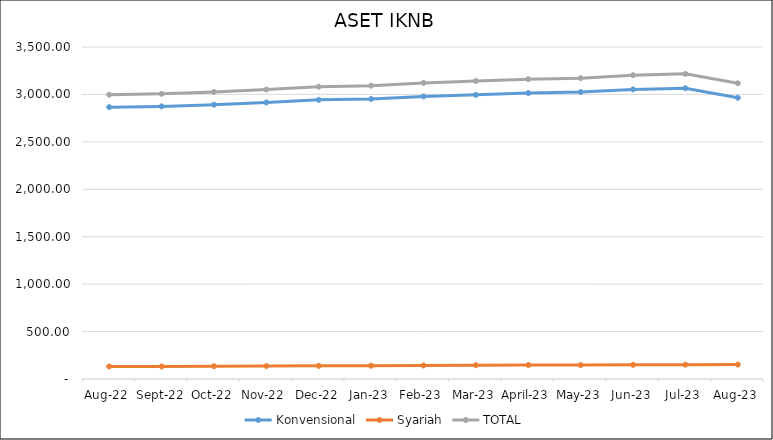
| Category |  Konvensional  |  Syariah  | TOTAL |
|---|---|---|---|
| Aug-22 | 2865.619 | 132.075 | 2997.694 |
| Sep-22 | 2873.938 | 132.351 | 3006.289 |
| Oct-22 | 2891.826 | 134.628 | 3026.454 |
| Nov-22 | 2915.393 | 136.376 | 3051.769 |
| Dec-22 | 2942.716 | 138.533 | 3081.249 |
| Jan-23 | 2951.832 | 140.165 | 3091.997 |
| Feb-23 | 2978.913 | 142.696 | 3121.609 |
| Mar-23 | 2995.706 | 146.066 | 3141.772 |
| April-23 | 3013.962 | 147.013 | 3160.975 |
| May-23 | 3025.142 | 146.46 | 3171.602 |
| Jun-23 | 3053.172 | 149.576 | 3202.747 |
| Jul-23 | 3065.53 | 151.21 | 3216.74 |
| Aug-23 | 2964.88 | 152.49 | 3117.37 |